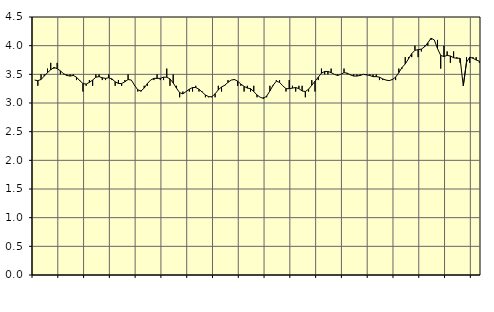
| Category | Piggar | Personliga och kulturella tjänster, SNI 90-981 |
|---|---|---|
| nan | 3.4 | 3.4 |
| 87.0 | 3.3 | 3.39 |
| 87.0 | 3.5 | 3.41 |
| 87.0 | 3.5 | 3.47 |
| nan | 3.6 | 3.53 |
| 88.0 | 3.7 | 3.58 |
| 88.0 | 3.6 | 3.62 |
| 88.0 | 3.7 | 3.6 |
| nan | 3.5 | 3.56 |
| 89.0 | 3.5 | 3.51 |
| 89.0 | 3.5 | 3.48 |
| 89.0 | 3.5 | 3.47 |
| nan | 3.5 | 3.48 |
| 90.0 | 3.4 | 3.45 |
| 90.0 | 3.4 | 3.39 |
| 90.0 | 3.2 | 3.34 |
| nan | 3.3 | 3.33 |
| 91.0 | 3.4 | 3.36 |
| 91.0 | 3.3 | 3.4 |
| 91.0 | 3.5 | 3.45 |
| nan | 3.5 | 3.46 |
| 92.0 | 3.4 | 3.44 |
| 92.0 | 3.4 | 3.43 |
| 92.0 | 3.5 | 3.44 |
| nan | 3.4 | 3.42 |
| 93.0 | 3.3 | 3.37 |
| 93.0 | 3.4 | 3.34 |
| 93.0 | 3.3 | 3.34 |
| nan | 3.4 | 3.37 |
| 94.0 | 3.5 | 3.41 |
| 94.0 | 3.4 | 3.4 |
| 94.0 | 3.3 | 3.31 |
| nan | 3.2 | 3.23 |
| 95.0 | 3.2 | 3.21 |
| 95.0 | 3.3 | 3.26 |
| 95.0 | 3.3 | 3.34 |
| nan | 3.4 | 3.4 |
| 96.0 | 3.4 | 3.43 |
| 96.0 | 3.5 | 3.43 |
| 96.0 | 3.4 | 3.43 |
| nan | 3.4 | 3.45 |
| 97.0 | 3.6 | 3.45 |
| 97.0 | 3.3 | 3.42 |
| 97.0 | 3.5 | 3.35 |
| nan | 3.3 | 3.26 |
| 98.0 | 3.1 | 3.18 |
| 98.0 | 3.2 | 3.16 |
| 98.0 | 3.2 | 3.2 |
| nan | 3.2 | 3.24 |
| 99.0 | 3.2 | 3.27 |
| 99.0 | 3.3 | 3.27 |
| 99.0 | 3.2 | 3.24 |
| nan | 3.2 | 3.19 |
| 0.0 | 3.1 | 3.14 |
| 0.0 | 3.1 | 3.11 |
| 0.0 | 3.1 | 3.11 |
| nan | 3.1 | 3.16 |
| 1.0 | 3.3 | 3.23 |
| 1.0 | 3.2 | 3.28 |
| 1.0 | 3.3 | 3.31 |
| nan | 3.4 | 3.36 |
| 2.0 | 3.4 | 3.4 |
| 2.0 | 3.4 | 3.41 |
| 2.0 | 3.3 | 3.38 |
| nan | 3.3 | 3.33 |
| 3.0 | 3.2 | 3.29 |
| 3.0 | 3.3 | 3.26 |
| 3.0 | 3.2 | 3.25 |
| nan | 3.3 | 3.2 |
| 4.0 | 3.1 | 3.14 |
| 4.0 | 3.1 | 3.1 |
| 4.0 | 3.1 | 3.08 |
| nan | 3.1 | 3.12 |
| 5.0 | 3.3 | 3.21 |
| 5.0 | 3.3 | 3.31 |
| 5.0 | 3.4 | 3.38 |
| nan | 3.4 | 3.36 |
| 6.0 | 3.3 | 3.3 |
| 6.0 | 3.2 | 3.25 |
| 6.0 | 3.4 | 3.25 |
| nan | 3.3 | 3.26 |
| 7.0 | 3.2 | 3.27 |
| 7.0 | 3.3 | 3.25 |
| 7.0 | 3.3 | 3.21 |
| nan | 3.1 | 3.2 |
| 8.0 | 3.2 | 3.24 |
| 8.0 | 3.4 | 3.31 |
| 8.0 | 3.2 | 3.38 |
| nan | 3.4 | 3.45 |
| 9.0 | 3.6 | 3.52 |
| 9.0 | 3.5 | 3.55 |
| 9.0 | 3.5 | 3.55 |
| nan | 3.6 | 3.53 |
| 10.0 | 3.5 | 3.5 |
| 10.0 | 3.5 | 3.48 |
| 10.0 | 3.5 | 3.5 |
| nan | 3.6 | 3.53 |
| 11.0 | 3.5 | 3.52 |
| 11.0 | 3.5 | 3.49 |
| 11.0 | 3.5 | 3.47 |
| nan | 3.5 | 3.47 |
| 12.0 | 3.5 | 3.48 |
| 12.0 | 3.5 | 3.5 |
| 12.0 | 3.5 | 3.49 |
| nan | 3.5 | 3.48 |
| 13.0 | 3.5 | 3.46 |
| 13.0 | 3.5 | 3.46 |
| 13.0 | 3.4 | 3.45 |
| nan | 3.4 | 3.42 |
| 14.0 | 3.4 | 3.4 |
| 14.0 | 3.4 | 3.39 |
| 14.0 | 3.4 | 3.41 |
| nan | 3.4 | 3.45 |
| 15.0 | 3.6 | 3.53 |
| 15.0 | 3.6 | 3.62 |
| 15.0 | 3.8 | 3.68 |
| nan | 3.8 | 3.77 |
| 16.0 | 3.8 | 3.86 |
| 16.0 | 4 | 3.92 |
| 16.0 | 3.8 | 3.93 |
| nan | 3.9 | 3.94 |
| 17.0 | 4 | 3.98 |
| 17.0 | 4 | 4.05 |
| 17.0 | 4.1 | 4.13 |
| nan | 4.1 | 4.1 |
| 18.0 | 4.1 | 3.95 |
| 18.0 | 3.6 | 3.83 |
| 18.0 | 4 | 3.81 |
| nan | 3.9 | 3.83 |
| 19.0 | 3.7 | 3.82 |
| 19.0 | 3.9 | 3.79 |
| 19.0 | 3.8 | 3.78 |
| nan | 3.7 | 3.78 |
| 20.0 | 3.3 | 3.3 |
| 20.0 | 3.8 | 3.71 |
| 20.0 | 3.7 | 3.8 |
| nan | 3.8 | 3.78 |
| 21.0 | 3.8 | 3.75 |
| 21.0 | 3.7 | 3.73 |